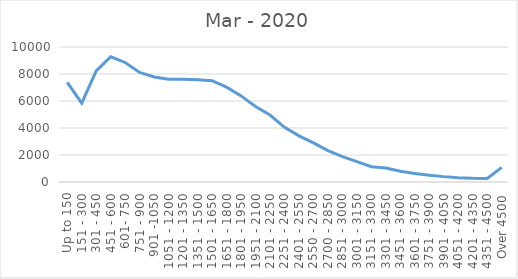
| Category | Mar - 2020 |
|---|---|
| Up to 150 | 7380 |
| 151 - 300 | 5843 |
| 301 - 450 | 8225 |
| 451 - 600 | 9279 |
| 601- 750 | 8855 |
| 751 - 900 | 8115 |
| 901 -1050 | 7777 |
| 1051 - 1200 | 7617 |
| 1201 - 1350 | 7616 |
| 1351 - 1500 | 7576 |
| 1501 - 1650 | 7507 |
| 1651 - 1800 | 7026 |
| 1801 - 1950 | 6377 |
| 1951 - 2100 | 5594 |
| 2101 - 2250 | 4958 |
| 2251 - 2400 | 4051 |
| 2401 - 2550 | 3422 |
| 2550 - 2700 | 2898 |
| 2700 - 2850 | 2329 |
| 2851 - 3000 | 1884 |
| 3001 - 3150 | 1510 |
| 3151 - 3300 | 1133 |
| 3301 - 3450 | 1033 |
| 3451 - 3600 | 803 |
| 3601 - 3750 | 634 |
| 3751 - 3900 | 507 |
| 3901 - 4050 | 398 |
| 4051 - 4200 | 318 |
| 4201 - 4350 | 271 |
| 4351 - 4500 | 256 |
| Over 4500 | 1084 |